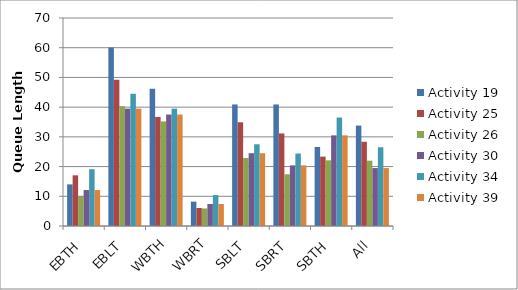
| Category | Activity 19 | Activity 25 | Activity 26 | Activity 30 | Activity 34 | Activity 39 |
|---|---|---|---|---|---|---|
| EBTH | 14 | 17.05 | 10.1 | 12.1 | 19.1 | 12.1 |
| EBLT | 60.1 | 49.2 | 40.3 | 39.5 | 44.5 | 39.5 |
| WBTH | 46.2 | 36.7 | 35.2 | 37.5 | 39.5 | 37.5 |
| WBRT | 8.2 | 6.05 | 5.9 | 7.4 | 10.4 | 7.4 |
| SBLT | 40.9 | 34.9 | 22.9 | 24.5 | 27.5 | 24.5 |
| SBRT | 40.9 | 31.15 | 17.4 | 20.4 | 24.4 | 20.4 |
| SBTH | 26.6 | 23.35 | 22.1 | 30.5 | 36.5 | 30.5 |
| All | 33.8 | 28.343 | 21.986 | 19.5 | 26.5 | 19.5 |